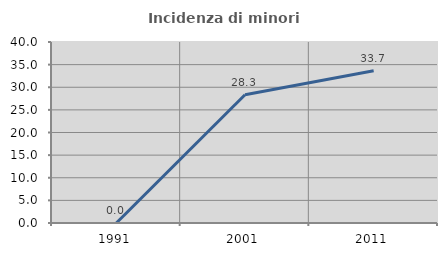
| Category | Incidenza di minori stranieri |
|---|---|
| 1991.0 | 0 |
| 2001.0 | 28.333 |
| 2011.0 | 33.663 |